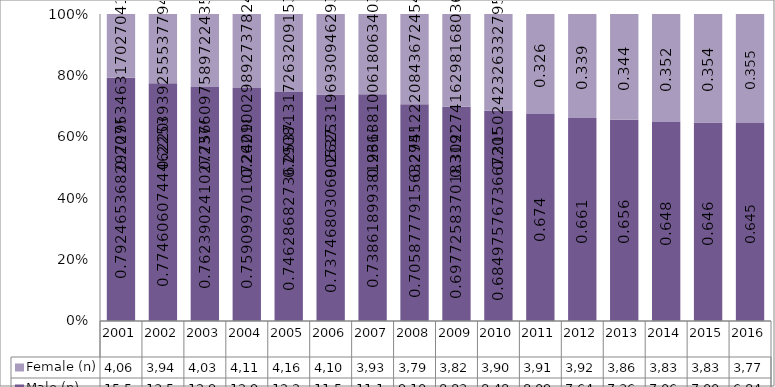
| Category | Male (n) | Female (n) |
|---|---|---|
| 2001.0 | 15503 | 4060 |
| 2002.0 | 13568 | 3948 |
| 2003.0 | 12937 | 4032 |
| 2004.0 | 12951 | 4110 |
| 2005.0 | 12260 | 4168 |
| 2006.0 | 11534 | 4106 |
| 2007.0 | 11114 | 3933 |
| 2008.0 | 9103 | 3793 |
| 2009.0 | 8836 | 3828 |
| 2010.0 | 8480 | 3900 |
| 2011.0 | 8090 | 3915 |
| 2012.0 | 7641 | 3920 |
| 2013.0 | 7362 | 3862 |
| 2014.0 | 7063 | 3839 |
| 2015.0 | 7001 | 3832 |
| 2016.0 | 6849 | 3775 |